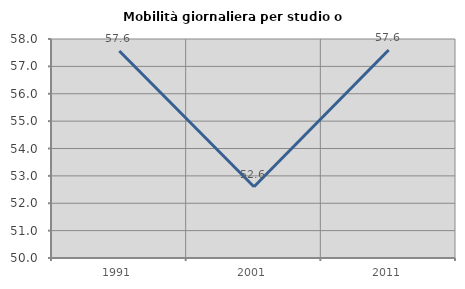
| Category | Mobilità giornaliera per studio o lavoro |
|---|---|
| 1991.0 | 57.563 |
| 2001.0 | 52.604 |
| 2011.0 | 57.6 |